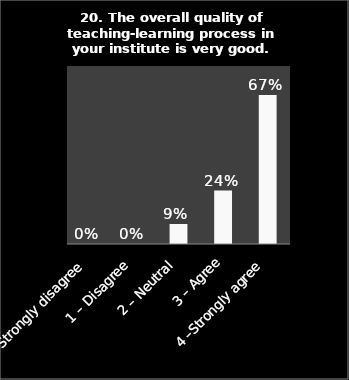
| Category | Series 0 |
|---|---|
| 0 – Strongly disagree | 0 |
| 1 – Disagree | 0 |
| 2 – Neutral | 0.09 |
| 3 – Agree | 0.24 |
| 4 –Strongly agree | 0.67 |